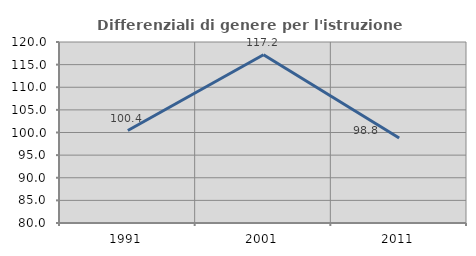
| Category | Differenziali di genere per l'istruzione superiore |
|---|---|
| 1991.0 | 100.431 |
| 2001.0 | 117.185 |
| 2011.0 | 98.8 |